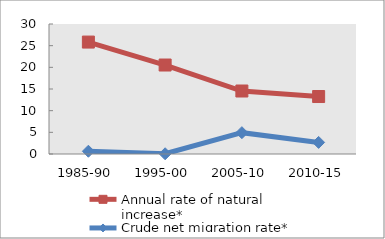
| Category | Annual rate of natural increase* | Crude net migration rate* |
|---|---|---|
| 1985-90 | 25.83 | 0.635 |
| 1995-00 | 20.533 | 0.053 |
| 2005-10 | 14.537 | 4.923 |
| 2010-15 | 13.264 | 2.678 |